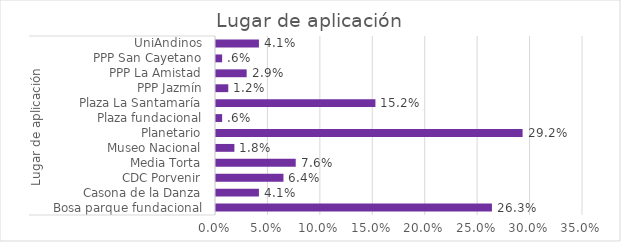
| Category | % del N de columna |
|---|---|
| 0 | 0.263 |
| 1 | 0.041 |
| 2 | 0.064 |
| 3 | 0.076 |
| 4 | 0.018 |
| 5 | 0.292 |
| 6 | 0.006 |
| 7 | 0.152 |
| 8 | 0.012 |
| 9 | 0.029 |
| 10 | 0.006 |
| 11 | 0.041 |